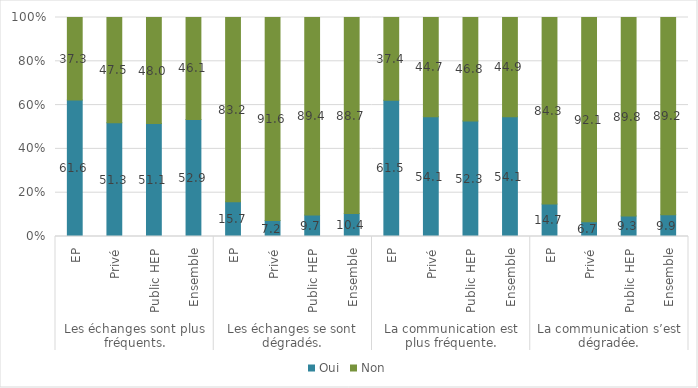
| Category | Oui | Non |
|---|---|---|
| 0 | 61.6 | 37.32 |
| 1 | 51.26 | 47.53 |
| 2 | 51.12 | 48.02 |
| 3 | 52.94 | 46.11 |
| 4 | 15.67 | 83.23 |
| 5 | 7.17 | 91.61 |
| 6 | 9.69 | 89.43 |
| 7 | 10.38 | 88.66 |
| 8 | 61.52 | 37.39 |
| 9 | 54.05 | 44.73 |
| 10 | 52.31 | 46.81 |
| 11 | 54.13 | 44.91 |
| 12 | 14.65 | 84.26 |
| 13 | 6.66 | 92.12 |
| 14 | 9.28 | 89.84 |
| 15 | 9.85 | 89.18 |